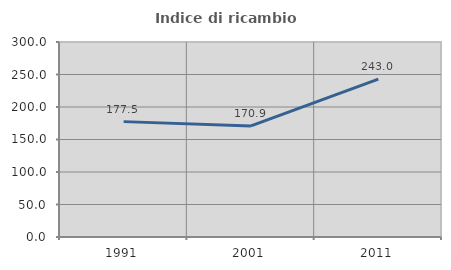
| Category | Indice di ricambio occupazionale  |
|---|---|
| 1991.0 | 177.5 |
| 2001.0 | 170.922 |
| 2011.0 | 242.969 |